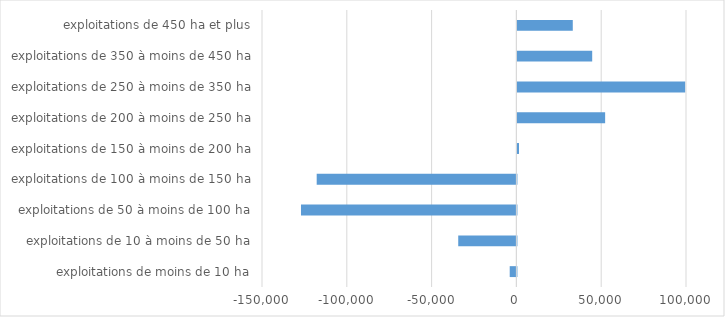
| Category | Series 0 |
|---|---|
| exploitations de moins de 10 ha | -3943.23 |
| exploitations de 10 à moins de 50 ha | -34297.94 |
| exploitations de 50 à moins de 100 ha | -127010.2 |
| exploitations de 100 à moins de 150 ha | -117752.34 |
| exploitations de 150 à moins de 200 ha | 961.82 |
| exploitations de 200 à moins de 250 ha | 51732.13 |
| exploitations de 250 à moins de 350 ha | 98913.3 |
| exploitations de 350 à moins de 450 ha | 44100.61 |
| exploitations de 450 ha et plus | 32656.07 |